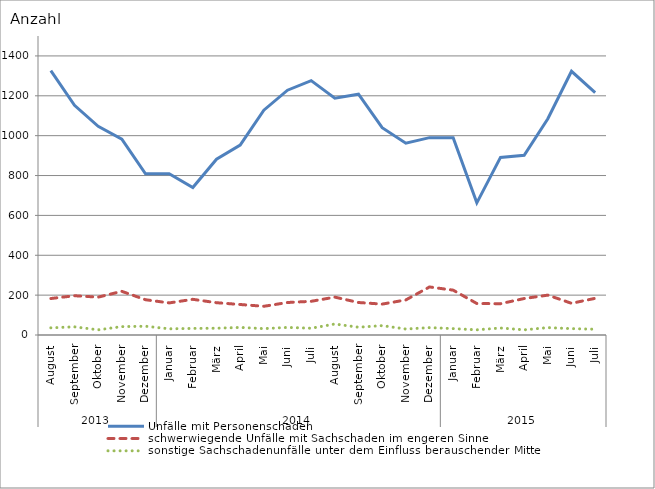
| Category | Unfälle mit Personenschaden | schwerwiegende Unfälle mit Sachschaden im engeren Sinne | sonstige Sachschadenunfälle unter dem Einfluss berauschender Mittel |
|---|---|---|---|
| 0 | 1326 | 183 | 36 |
| 1 | 1152 | 197 | 41 |
| 2 | 1047 | 190 | 26 |
| 3 | 983 | 219 | 42 |
| 4 | 809 | 177 | 44 |
| 5 | 809 | 161 | 31 |
| 6 | 740 | 179 | 33 |
| 7 | 882 | 162 | 34 |
| 8 | 953 | 153 | 38 |
| 9 | 1128 | 144 | 32 |
| 10 | 1228 | 163 | 38 |
| 11 | 1276 | 169 | 34 |
| 12 | 1188 | 190 | 55 |
| 13 | 1208 | 163 | 39 |
| 14 | 1040 | 155 | 47 |
| 15 | 962 | 176 | 30 |
| 16 | 990 | 241 | 37 |
| 17 | 990 | 225 | 32 |
| 18 | 663 | 158 | 26 |
| 19 | 891 | 157 | 35 |
| 20 | 902 | 183 | 26 |
| 21 | 1085 | 200 | 37 |
| 22 | 1323 | 159 | 32 |
| 23 | 1216 | 184 | 29 |